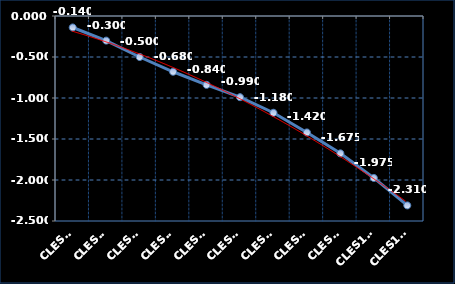
| Category | Series 0 |
|---|---|
| CLES1F | -0.14 |
| CLES2F | -0.3 |
| CLES3F | -0.5 |
| CLES4F | -0.68 |
| CLES5F | -0.84 |
| CLES6F | -0.99 |
| CLES7F | -1.18 |
| CLES8F | -1.42 |
| CLES9F | -1.675 |
| CLES10F | -1.975 |
| CLES11F | -2.31 |